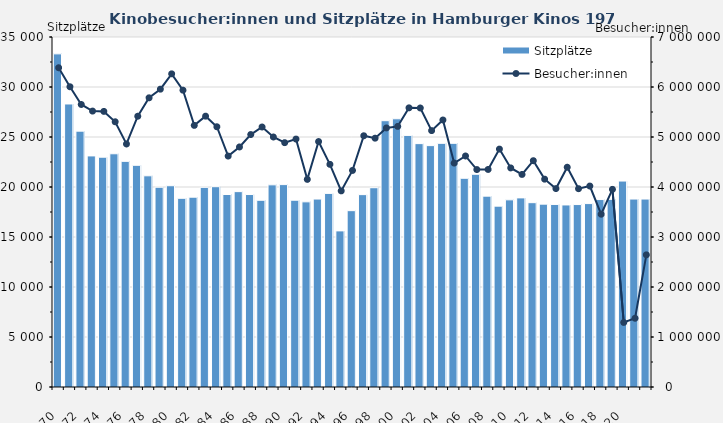
| Category | Sitzplätze |
|---|---|
| 0 | 33313 |
| 1 | 28302 |
| 2 | 25585 |
| 3 | 23109 |
| 4 | 22980 |
| 5 | 23322 |
| 6 | 22565 |
| 7 | 22169 |
| 8 | 21120 |
| 9 | 19977 |
| 10 | 20128 |
| 11 | 18869 |
| 12 | 18982 |
| 13 | 19967 |
| 14 | 20030 |
| 15 | 19249 |
| 16 | 19537 |
| 17 | 19248 |
| 18 | 18671 |
| 19 | 20217 |
| 20 | 20240 |
| 21 | 18679 |
| 22 | 18516 |
| 23 | 18794 |
| 24 | 19362 |
| 25 | 15612 |
| 26 | 17633 |
| 27 | 19237 |
| 28 | 19928 |
| 29 | 26631 |
| 30 | 26822 |
| 31 | 25160 |
| 32 | 24337 |
| 33 | 24136 |
| 34 | 24367 |
| 35 | 24367 |
| 36 | 20873 |
| 37 | 21273 |
| 38 | 19086 |
| 39 | 18087 |
| 40 | 18716 |
| 41 | 18912 |
| 42 | 18432 |
| 43 | 18286 |
| 44 | 18256 |
| 45 | 18205 |
| 46 | 18245 |
| 47 | 18341 |
| 48 | 18744 |
| 49 | 18764 |
| 50 | 20595 |
| 51 | 18795 |
| 52 | 18795 |